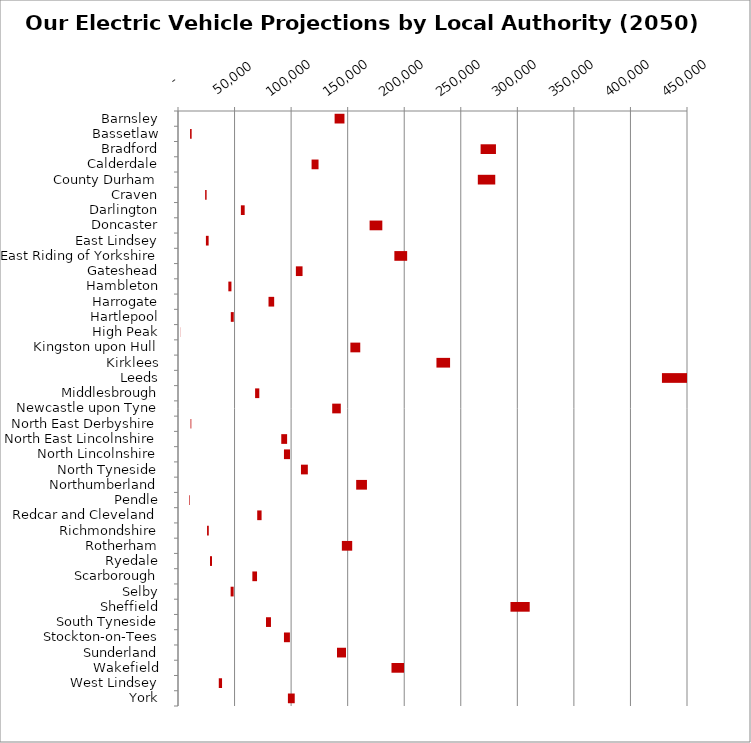
| Category | MIN | MAX |
|---|---|---|
| Barnsley | 138453 | 8712 |
| Bassetlaw | 10670 | 1392 |
| Bradford | 267533 | 13566 |
| Calderdale | 118095 | 6148 |
| County Durham | 265058 | 15425 |
| Craven | 23992 | 1303 |
| Darlington | 55589 | 3358 |
| Doncaster | 169393 | 11243 |
| East Lindsey | 24677 | 2406 |
| East Riding of Yorkshire | 191284 | 11311 |
| Gateshead | 104214 | 5896 |
| Hambleton | 44512 | 2731 |
| Harrogate | 80026 | 5000 |
| Hartlepool | 46671 | 2604 |
| High Peak | 2086 | 157 |
| Kingston upon Hull | 152403 | 8725 |
| Kirklees | 228491 | 12046 |
| Leeds | 427846 | 23679 |
| Middlesbrough | 68170 | 3713 |
| Newcastle upon Tyne | 136326 | 7593 |
| North East Derbyshire | 11097 | 659 |
| North East Lincolnshire | 91296 | 5167 |
| North Lincolnshire | 93672 | 5332 |
| North Tyneside | 108713 | 6079 |
| Northumberland | 157530 | 9522 |
| Pendle | 9740 | 543 |
| Redcar and Cleveland | 70030 | 3860 |
| Richmondshire | 25691 | 1513 |
| Rotherham | 144867 | 9141 |
| Ryedale | 28272 | 1791 |
| Scarborough | 65733 | 4138 |
| Selby | 46524 | 2668 |
| Sheffield | 293936 | 17002 |
| South Tyneside | 77803 | 4387 |
| Stockton-on-Tees | 93674 | 5264 |
| Sunderland | 140554 | 7955 |
| Wakefield | 188738 | 11099 |
| West Lindsey | 36054 | 2890 |
| York | 97161 | 6037 |